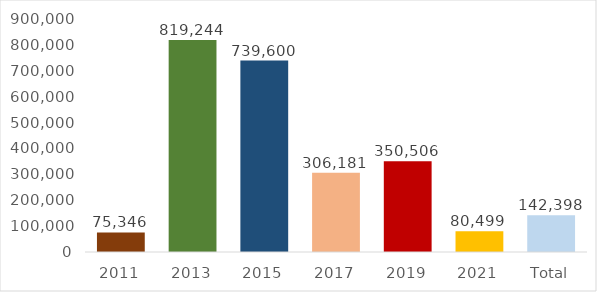
| Category | Vlerë mesatare dhurimi |
|---|---|
| 2011 | 75345.591 |
| 2013 | 819243.837 |
| 2015 | 739600 |
| 2017 | 306181.056 |
| 2019 | 350506.04 |
| 2021 | 80499.161 |
| Total | 142398.179 |